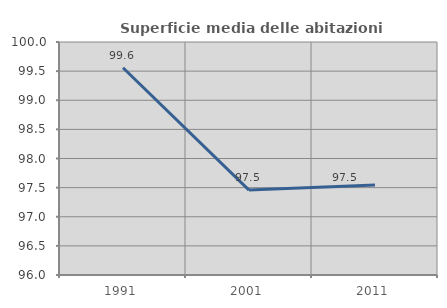
| Category | Superficie media delle abitazioni occupate |
|---|---|
| 1991.0 | 99.557 |
| 2001.0 | 97.458 |
| 2011.0 | 97.543 |